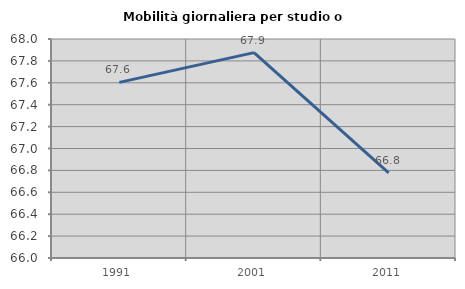
| Category | Mobilità giornaliera per studio o lavoro |
|---|---|
| 1991.0 | 67.604 |
| 2001.0 | 67.876 |
| 2011.0 | 66.778 |